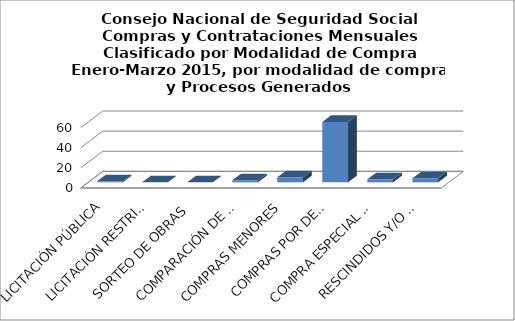
| Category | Series 0 |
|---|---|
| LICITACIÓN PÚBLICA | 1 |
| LICITACIÓN RESTRINGIDA | 0 |
| SORTEO DE OBRAS | 0 |
| COMPARACIÓN DE PRECIOS | 2 |
| COMPRAS MENORES | 5 |
| COMPRAS POR DEBAJO DEL UMBRAL MÍNIMO | 60 |
| COMPRA ESPECIAL RECURRENTE | 3 |
| RESCINDIDOS Y/O CANCELADOS | 4 |